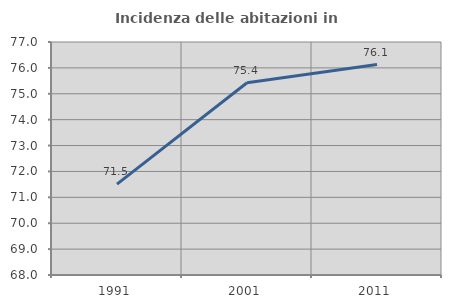
| Category | Incidenza delle abitazioni in proprietà  |
|---|---|
| 1991.0 | 71.512 |
| 2001.0 | 75.424 |
| 2011.0 | 76.127 |